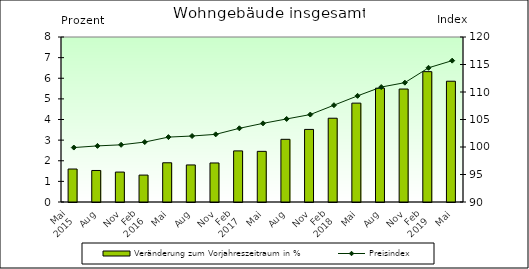
| Category | Veränderung zum Vorjahreszeitraum in % |
|---|---|
| 0 | 1.599 |
| 1 | 1.529 |
| 2 | 1.451 |
| 3 | 1.305 |
| 4 | 1.902 |
| 5 | 1.796 |
| 6 | 1.892 |
| 7 | 2.478 |
| 8 | 2.456 |
| 9 | 3.039 |
| 10 | 3.519 |
| 11 | 4.062 |
| 12 | 4.794 |
| 13 | 5.519 |
| 14 | 5.477 |
| 15 | 6.32 |
| 16 | 5.855 |